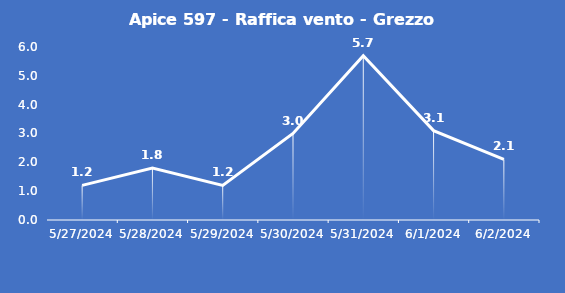
| Category | Apice 597 - Raffica vento - Grezzo (m/s) |
|---|---|
| 5/27/24 | 1.2 |
| 5/28/24 | 1.8 |
| 5/29/24 | 1.2 |
| 5/30/24 | 3 |
| 5/31/24 | 5.7 |
| 6/1/24 | 3.1 |
| 6/2/24 | 2.1 |